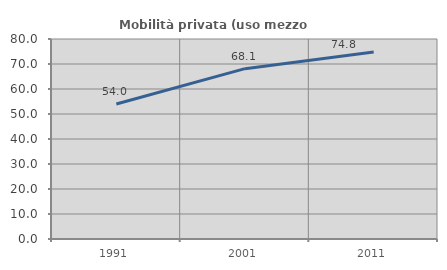
| Category | Mobilità privata (uso mezzo privato) |
|---|---|
| 1991.0 | 54.023 |
| 2001.0 | 68.134 |
| 2011.0 | 74.805 |